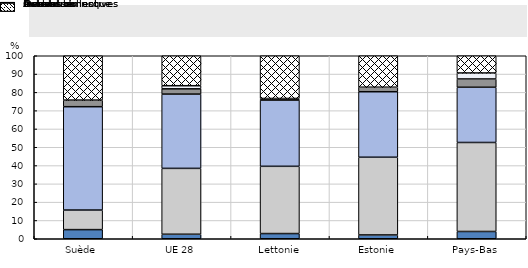
| Category | Innovation | Investissement | Durabilité | Actions collectives | Gestion du risque | Autres |
|---|---|---|---|---|---|---|
| Suède | 4.99 | 10.699 | 56.476 | 3.62 | 0 | 24.215 |
| UE 28 | 2.464 | 35.994 | 40.59 | 2.878 | 1.702 | 16.372 |
| Lettonie | 2.839 | 36.747 | 36.242 | 0.182 | 0.653 | 23.337 |
| Estonie | 2.083 | 42.467 | 35.788 | 2.488 | 0 | 17.174 |
| Pays-Bas | 3.976 | 48.633 | 30.173 | 4.53 | 3.282 | 9.405 |